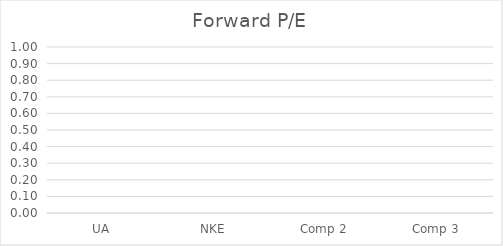
| Category | Forward P/E |
|---|---|
| UA | 0 |
| NKE | 0 |
| Comp 2 | 0 |
| Comp 3 | 0 |